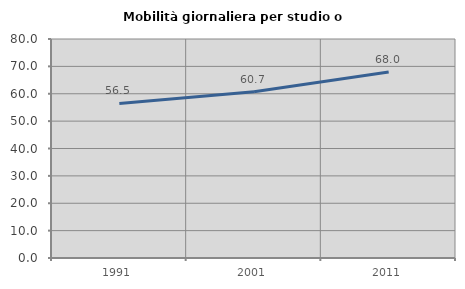
| Category | Mobilità giornaliera per studio o lavoro |
|---|---|
| 1991.0 | 56.46 |
| 2001.0 | 60.712 |
| 2011.0 | 67.968 |